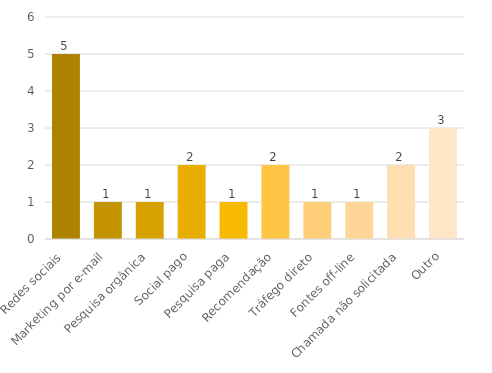
| Category | Series 0 |
|---|---|
| Redes sociais | 5 |
| Marketing por e-mail | 1 |
| Pesquisa orgânica | 1 |
| Social pago | 2 |
| Pesquisa paga | 1 |
| Recomendação | 2 |
| Tráfego direto | 1 |
| Fontes off-line | 1 |
| Chamada não solicitada | 2 |
| Outro | 3 |